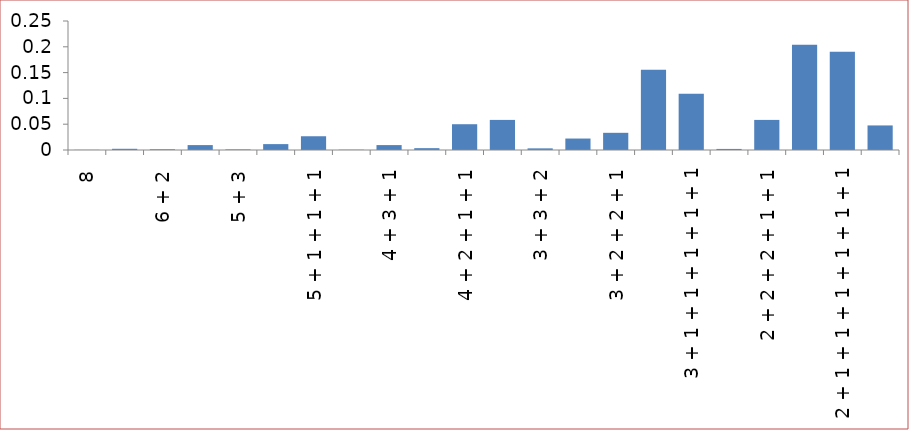
| Category | Series 0 |
|---|---|
| 8 | 0 |
| 7 + 1 | 0.002 |
| 6 + 2 | 0.001 |
| 6 + 1 + 1 | 0.01 |
| 5 + 3 | 0.001 |
| 5 + 2 + 1 | 0.011 |
| 5 + 1 + 1 + 1 | 0.027 |
| 4 + 4 | 0.001 |
| 4 + 3 + 1 | 0.01 |
| 4 + 2 + 2 | 0.004 |
| 4 + 2 + 1 + 1 | 0.05 |
| 4 + 1 + 1 + 1 + 1 | 0.058 |
| 3 + 3 + 2 | 0.003 |
| 3 + 3 + 1 + 1 | 0.022 |
| 3 + 2 + 2 + 1 | 0.033 |
| 3 + 2 + 1 + 1 + 1 | 0.155 |
| 3 + 1 + 1 + 1 + 1 + 1 | 0.109 |
| 2 + 2 + 2 + 2 | 0.002 |
| 2 + 2 + 2 + 1 + 1 | 0.058 |
| 2 + 2 + 1 + 1 + 1 + 1 | 0.204 |
| 2 + 1 + 1 + 1 + 1 + 1 + 1 | 0.19 |
| 1 + 1 + 1 + 1 + 1 + 1 + 1 + 1 | 0.048 |